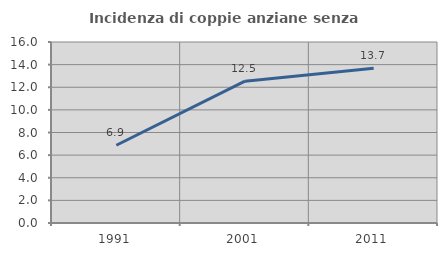
| Category | Incidenza di coppie anziane senza figli  |
|---|---|
| 1991.0 | 6.87 |
| 2001.0 | 12.54 |
| 2011.0 | 13.681 |